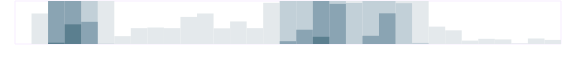
| Category | Продажи | Series 1 | Series 2 | Series 3 |
|---|---|---|---|---|
| 0.333333333333333 | 0 | 0 | 0 | 0 |
| nan | 532 | 0 | 0 | 0 |
| nan | 750 | 750 | 750 | 23 |
| nan | 750 | 750 | 750 | 343 |
| 0.416666666666667 | 750 | 750 | 387 | 0 |
| nan | 750 | 5 | 0 | 0 |
| nan | 137 | 0 | 0 | 0 |
| nan | 276 | 0 | 0 | 0 |
| 0.5 | 287 | 0 | 0 | 0 |
| nan | 276 | 0 | 0 | 0 |
| nan | 472 | 0 | 0 | 0 |
| nan | 532 | 0 | 0 | 0 |
| 0.583333333333333 | 273 | 0 | 0 | 0 |
| nan | 393 | 0 | 0 | 0 |
| nan | 276 | 0 | 0 | 0 |
| nan | 718 | 0 | 0 | 0 |
| 0.666666666666667 | 750 | 750 | 49 | 0 |
| nan | 750 | 750 | 249 | 0 |
| nan | 750 | 750 | 750 | 126 |
| nan | 750 | 750 | 700 | 0 |
| 0.75 | 750 | 715 | 0 | 0 |
| nan | 750 | 750 | 143 | 0 |
| nan | 750 | 750 | 535 | 0 |
| nan | 750 | 712 | 0 | 0 |
| 0.833333333333333 | 750 | 19 | 0 | 0 |
| nan | 303 | 0 | 0 | 0 |
| nan | 238 | 0 | 0 | 0 |
| nan | 59 | 0 | 0 | 0 |
| 0.916666666666667 | 90 | 0 | 0 | 0 |
| nan | 80 | 0 | 0 | 0 |
| nan | 11 | 0 | 0 | 0 |
| nan | 96 | 0 | 0 | 0 |
| 0.9993055555555556 | 71 | 0 | 0 | 0 |